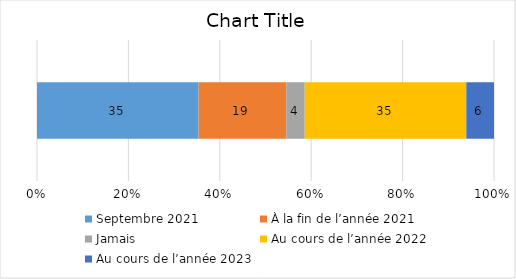
| Category | Septembre 2021 | À la fin de l’année 2021 | Jamais | Au cours de l’année 2022 | Au cours de l’année 2023 |
|---|---|---|---|---|---|
| 0 | 35 | 19 | 4 | 35 | 6 |